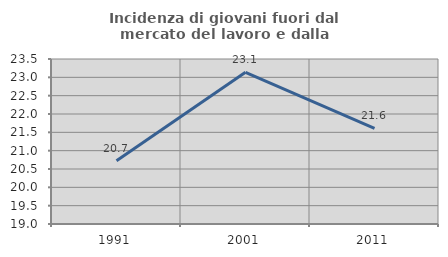
| Category | Incidenza di giovani fuori dal mercato del lavoro e dalla formazione  |
|---|---|
| 1991.0 | 20.723 |
| 2001.0 | 23.138 |
| 2011.0 | 21.611 |